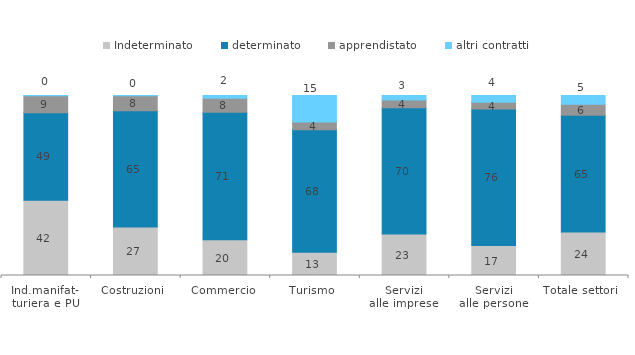
| Category | Indeterminato | determinato | apprendistato | altri contratti |
|---|---|---|---|---|
| Ind.manifat-
turiera e PU | 41.795 | 48.678 | 9.416 | 0.11 |
| Costruzioni | 26.88 | 64.64 | 8.32 | 0.16 |
| Commercio | 19.841 | 70.833 | 7.738 | 1.587 |
| Turismo | 12.848 | 68.134 | 4.299 | 14.719 |
| Servizi
alle imprese | 23.039 | 70.207 | 4.248 | 2.505 |
| Servizi
alle persone | 16.638 | 75.815 | 3.774 | 3.774 |
| Totale settori | 24.232 | 64.755 | 6.195 | 4.818 |